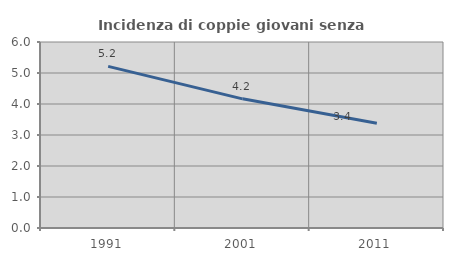
| Category | Incidenza di coppie giovani senza figli |
|---|---|
| 1991.0 | 5.213 |
| 2001.0 | 4.167 |
| 2011.0 | 3.382 |